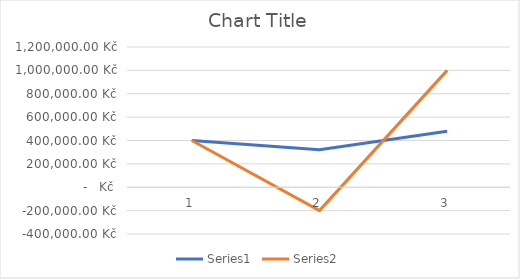
| Category | Series 0 | Series 1 |
|---|---|---|
| 0 | 400000 | 400000 |
| 1 | 320000 | -200000 |
| 2 | 480000 | 1000000 |